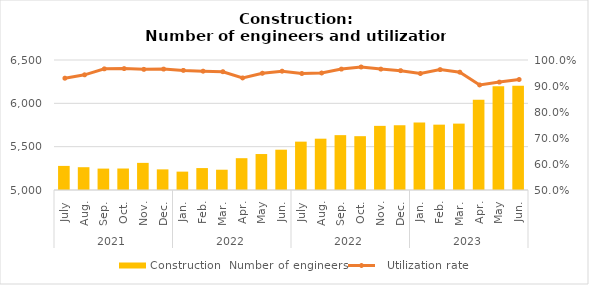
| Category | Construction |
|---|---|
| 0 | 5278 |
| 1 | 5263 |
| 2 | 5247 |
| 3 | 5248 |
| 4 | 5313 |
| 5 | 5238 |
| 6 | 5212 |
| 7 | 5253 |
| 8 | 5234 |
| 9 | 5367 |
| 10 | 5415 |
| 11 | 5465 |
| 12 | 5558 |
| 13 | 5592 |
| 14 | 5633 |
| 15 | 5621 |
| 16 | 5740 |
| 17 | 5746 |
| 18 | 5780 |
| 19 | 5754 |
| 20 | 5766 |
| 21 | 6042 |
| 22 | 6196 |
| 23 | 6204 |